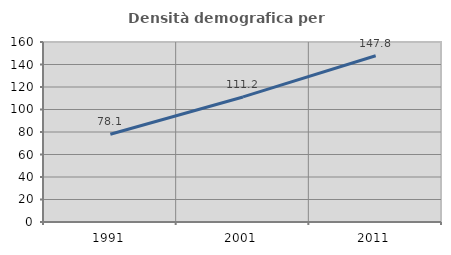
| Category | Densità demografica |
|---|---|
| 1991.0 | 78.06 |
| 2001.0 | 111.168 |
| 2011.0 | 147.775 |